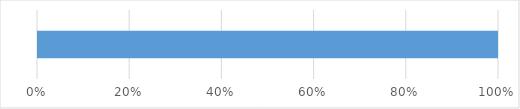
| Category | Series 0 | Series 1 | Series 2 | Series 3 | Series 4 |
|---|---|---|---|---|---|
| 0 | 0 | 0 | 0 | 0 | 10 |